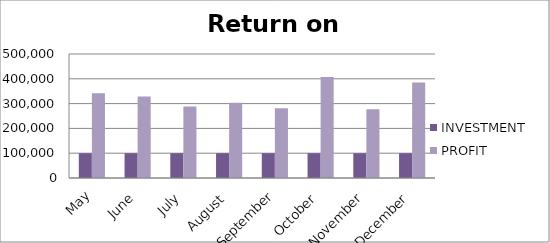
| Category | INVESTMENT  | PROFIT |
|---|---|---|
| May | 100000 | 341995 |
| June | 100000 | 328918 |
| July | 100000 | 288028 |
| August | 100000 | 303853 |
| September | 100000 | 281093 |
| October | 100000 | 407723 |
| November | 100000 | 276937 |
| December | 100000 | 385327 |